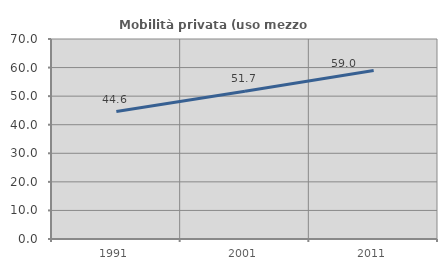
| Category | Mobilità privata (uso mezzo privato) |
|---|---|
| 1991.0 | 44.595 |
| 2001.0 | 51.707 |
| 2011.0 | 58.988 |